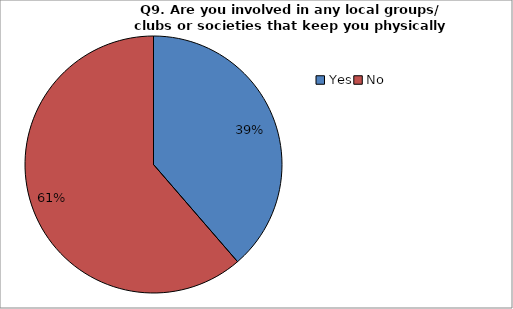
| Category | Series 0 |
|---|---|
| Yes | 172 |
| No | 273 |